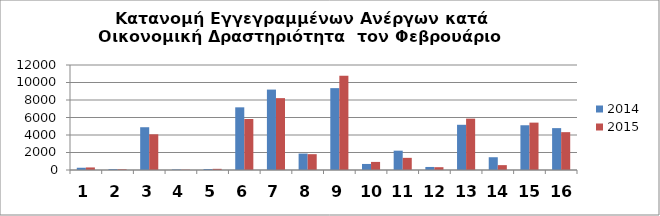
| Category | 2014 | 2015 |
|---|---|---|
| 0 | 257 | 293 |
| 1 | 101 | 81 |
| 2 | 4888 | 4080 |
| 3 | 62 | 35 |
| 4 | 116 | 133 |
| 5 | 7162 | 5826 |
| 6 | 9190 | 8213 |
| 7 | 1878 | 1808 |
| 8 | 9356 | 10771 |
| 9 | 691 | 924 |
| 10 | 2209 | 1389 |
| 11 | 347 | 321 |
| 12 | 5167 | 5870 |
| 13 | 1459 | 556 |
| 14 | 5114 | 5414 |
| 15 | 4786 | 4325 |